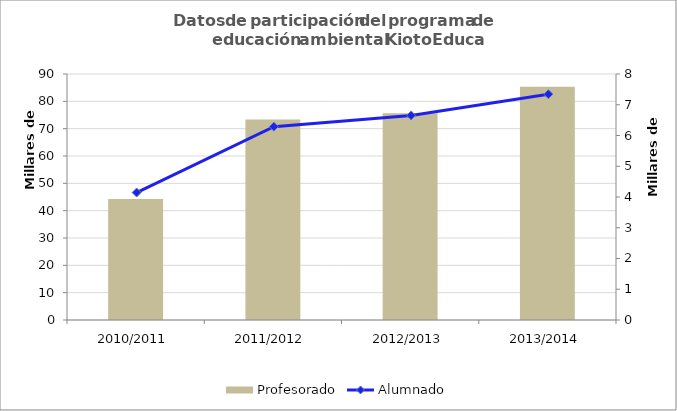
| Category | Profesorado |
|---|---|
| 2010/2011 | 3938 |
| 2011/2012 | 6521 |
| 2012/2013 | 6725 |
| 2013/2014 | 7588 |